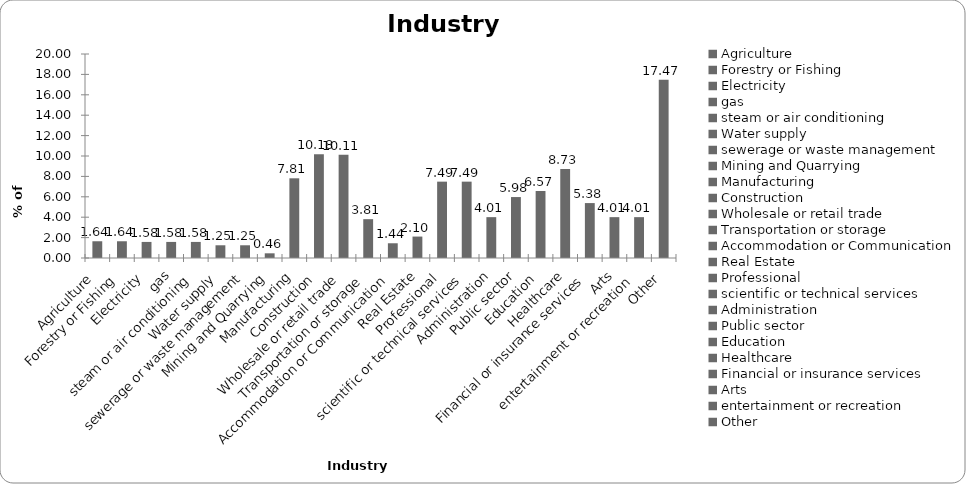
| Category | Industry sector |
|---|---|
| Agriculture | 1.641 |
| Forestry or Fishing | 1.641 |
| Electricity | 1.576 |
| gas | 1.576 |
| steam or air conditioning | 1.576 |
| Water supply | 1.248 |
| sewerage or waste management | 1.248 |
| Mining and Quarrying | 0.46 |
| Manufacturing | 7.814 |
| Construction | 10.177 |
| Wholesale or retail trade | 10.112 |
| Transportation or storage | 3.808 |
| Accommodation or Communication | 1.445 |
| Real Estate | 2.101 |
| Professional | 7.485 |
| scientific or technical services | 7.485 |
| Administration | 4.005 |
| Public sector | 5.975 |
| Education | 6.566 |
| Healthcare | 8.733 |
| Financial or insurance services | 5.384 |
| Arts | 4.005 |
| entertainment or recreation | 4.005 |
| Other | 17.466 |